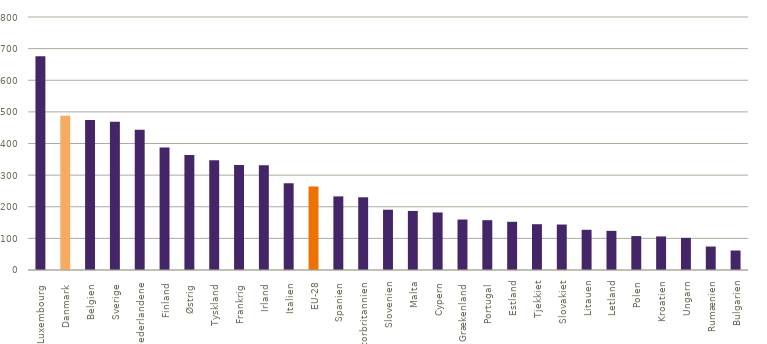
| Category | 2013 |
|---|---|
| Luxembourg  | 675.8 |
| Danmark  | 487.893 |
| Belgien  | 474.179 |
| Sverige  | 468.656 |
| Nederlandene  | 443.655 |
| Finland  | 387.593 |
| Østrig  | 363.365 |
| Tyskland  | 347.234 |
| Frankrig  | 332.259 |
| Irland  | 331.391 |
| Italien  | 274.229 |
| EU-28 | 264.117 |
| Spanien  | 232.76 |
| Storbritannien  | 229.958 |
| Slovenien | 190.619 |
| Malta | 186.75 |
| Cypern | 182 |
| Grækenland  | 159.586 |
| Portugal  | 157.543 |
| Estland | 152.462 |
| Tjekkiet | 144.781 |
| Slovakiet | 143.796 |
| Litauen | 127.133 |
| Letland | 123.8 |
| Polen | 107.291 |
| Kroatien | 106.116 |
| Ungarn | 101.636 |
| Rumænien | 74.23 |
| Bulgarien | 61.603 |